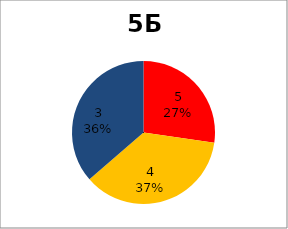
| Category | Series 0 |
|---|---|
| 5.0 | 3 |
| 4.0 | 4 |
| 3.0 | 4 |